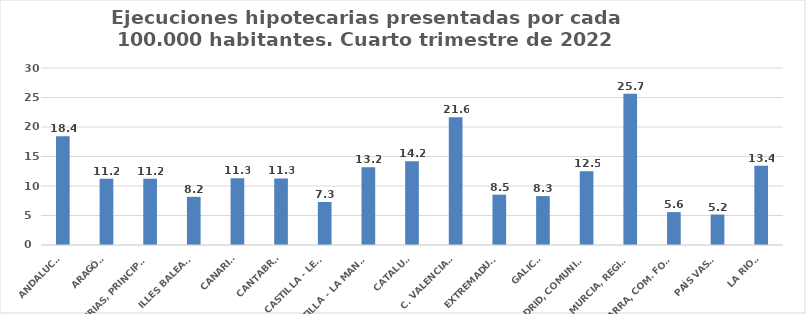
| Category | Series 0 |
|---|---|
| ANDALUCÍA | 18.435 |
| ARAGÓN | 11.234 |
| ASTURIAS, PRINCIPADO | 11.247 |
| ILLES BALEARS | 8.159 |
| CANARIAS | 11.296 |
| CANTABRIA | 11.274 |
| CASTILLA - LEÓN | 7.291 |
| CASTILLA - LA MANCHA | 13.198 |
| CATALUÑA | 14.18 |
| C. VALENCIANA | 21.636 |
| EXTREMADURA | 8.533 |
| GALICIA | 8.289 |
| MADRID, COMUNIDAD | 12.488 |
| MURCIA, REGIÓN | 25.655 |
| NAVARRA, COM. FORAL | 5.571 |
| PAÍS VASCO | 5.163 |
| LA RIOJA | 13.442 |